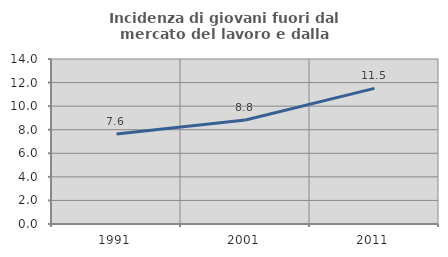
| Category | Incidenza di giovani fuori dal mercato del lavoro e dalla formazione  |
|---|---|
| 1991.0 | 7.643 |
| 2001.0 | 8.824 |
| 2011.0 | 11.511 |